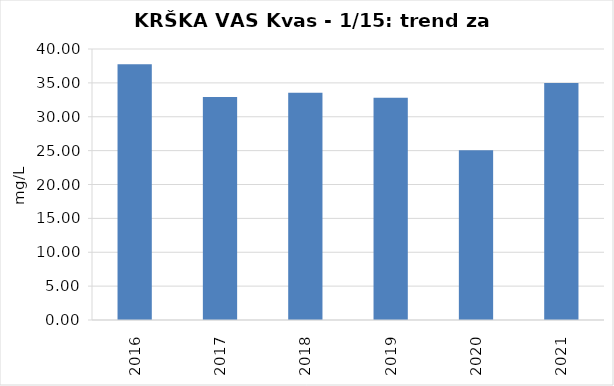
| Category | Vsota |
|---|---|
| 2016 | 37.75 |
| 2017 | 32.9 |
| 2018 | 33.55 |
| 2019 | 32.8 |
| 2020 | 25.05 |
| 2021 | 35 |